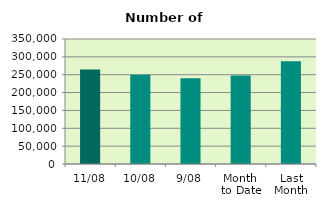
| Category | Series 0 |
|---|---|
| 11/08 | 264912 |
| 10/08 | 250204 |
| 9/08 | 239882 |
| Month 
to Date | 247678.5 |
| Last
Month | 287917.636 |